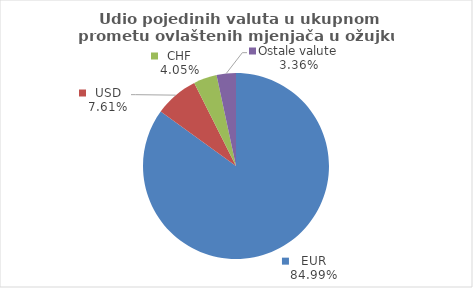
| Category | Series 0 |
|---|---|
| EUR | 84.983 |
| USD | 7.607 |
| CHF | 4.05 |
| Ostale valute | 3.36 |